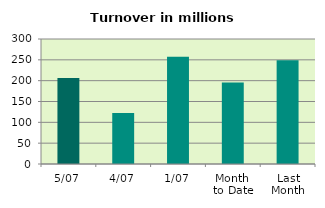
| Category | Series 0 |
|---|---|
| 5/07 | 206.534 |
| 4/07 | 122.58 |
| 1/07 | 257.22 |
| Month 
to Date | 195.445 |
| Last
Month | 248.976 |